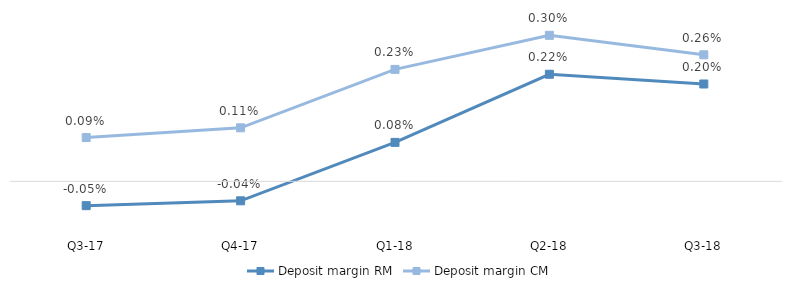
| Category | Deposit margin RM | Deposit margin CM |
|---|---|---|
| Q3-18 | 0.002 | 0.003 |
| Q2-18 | 0.002 | 0.003 |
| Q1-18 | 0.001 | 0.002 |
| Q4-17 | 0 | 0.001 |
| Q3-17 | 0 | 0.001 |